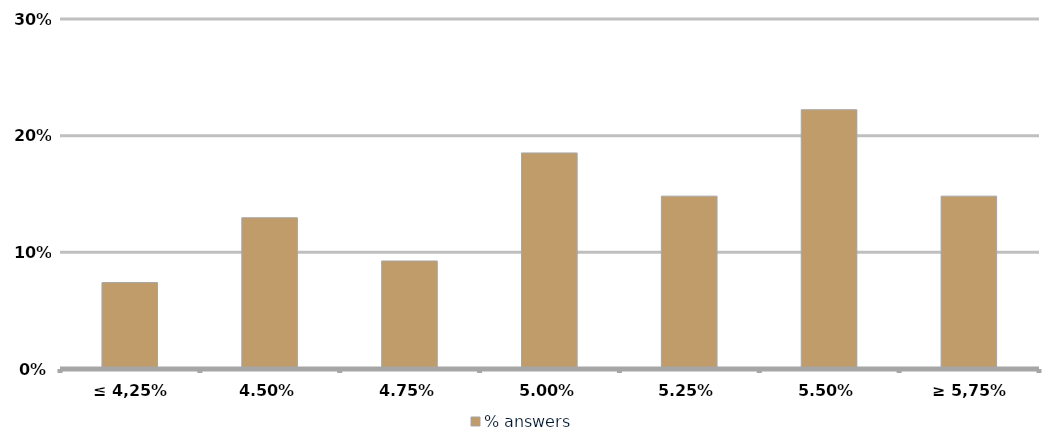
| Category | % answers |
|---|---|
| ≤ 4,25% | 0.074 |
| 4,50% | 0.13 |
| 4,75% | 0.093 |
| 5,00% | 0.185 |
| 5,25% | 0.148 |
| 5,50% | 0.222 |
| ≥ 5,75% | 0.148 |